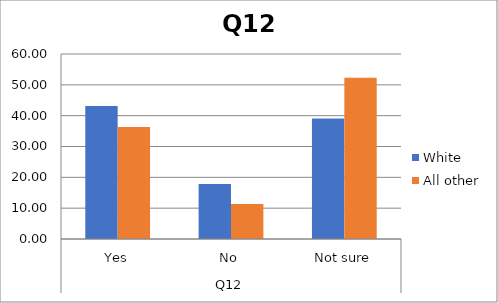
| Category | White | All other |
|---|---|---|
| 0 | 43.103 | 36.364 |
| 1 | 17.816 | 11.364 |
| 2 | 39.08 | 52.273 |